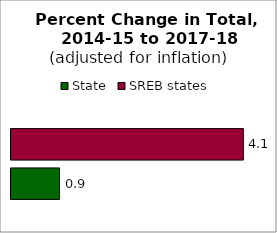
| Category | State | SREB states |
|---|---|---|
| 0 | 0.85 | 4.069 |